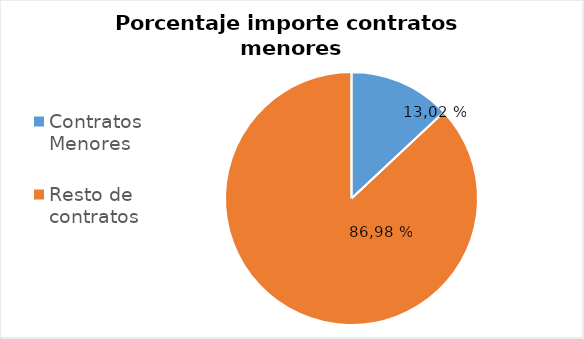
| Category | Series 0 |
|---|---|
| Contratos Menores | 13.023 |
| Resto de contratos | 86.977 |